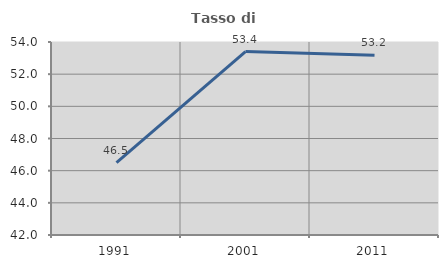
| Category | Tasso di occupazione   |
|---|---|
| 1991.0 | 46.494 |
| 2001.0 | 53.406 |
| 2011.0 | 53.179 |